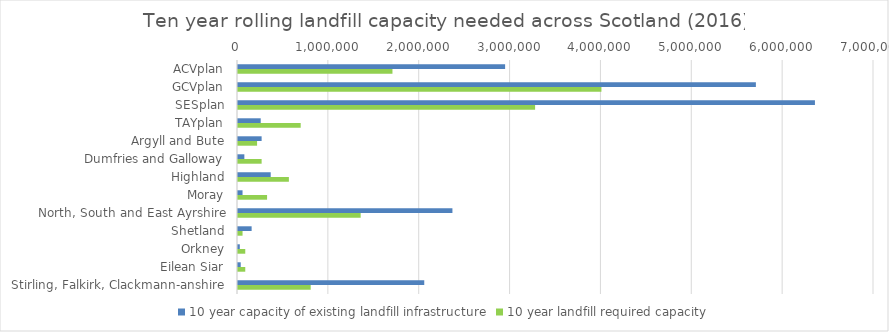
| Category | 10 year capacity of existing landfill infrastructure | 10 year landfill required capacity |
|---|---|---|
| ACVplan | 2940000 | 1700000 |
| GCVplan | 5700000 | 4000000 |
| SESplan | 6350000 | 3270000 |
| TAYplan | 250000 | 690000 |
| Argyll and Bute | 260000 | 210000 |
| Dumfries and Galloway | 70000 | 260000 |
| Highland | 360000 | 560000 |
| Moray | 50000 | 320000 |
| North, South and East Ayrshire | 2360000 | 1350000 |
| Shetland | 150000 | 50000 |
| Orkney | 20000 | 80000 |
| Eilean Siar | 30000 | 80000 |
| Stirling, Falkirk, Clackmann-anshire | 2050000 | 800000 |